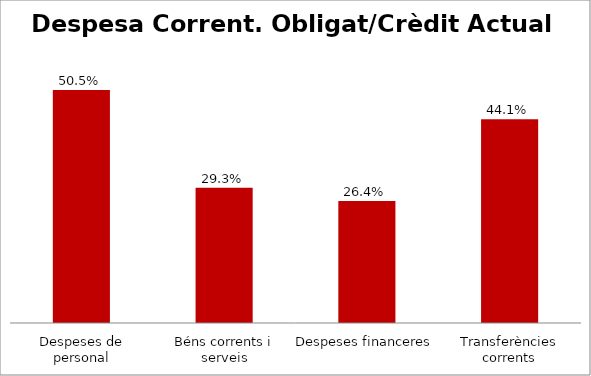
| Category | Series 0 |
|---|---|
| Despeses de personal | 0.505 |
| Béns corrents i serveis | 0.293 |
| Despeses financeres | 0.264 |
| Transferències corrents | 0.441 |